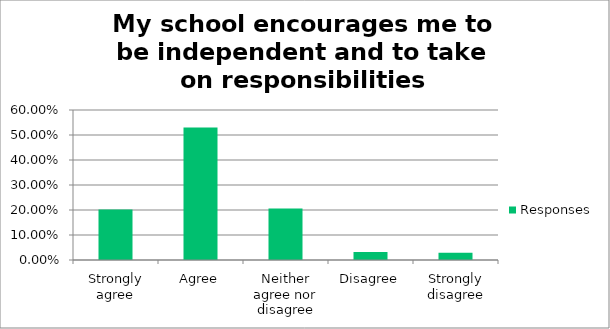
| Category | Responses |
|---|---|
| Strongly agree | 0.202 |
| Agree | 0.53 |
| Neither agree nor disagree | 0.206 |
| Disagree | 0.032 |
| Strongly disagree | 0.029 |